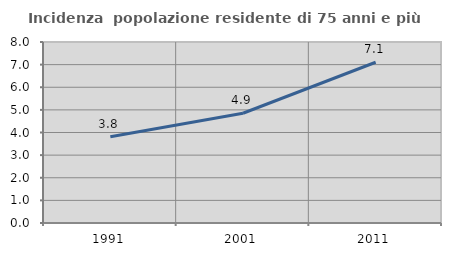
| Category | Incidenza  popolazione residente di 75 anni e più |
|---|---|
| 1991.0 | 3.812 |
| 2001.0 | 4.852 |
| 2011.0 | 7.104 |